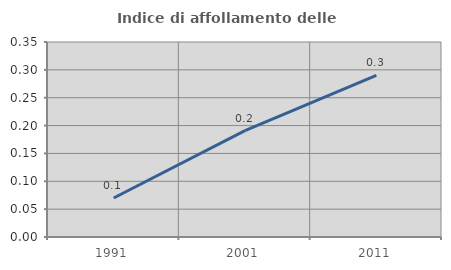
| Category | Indice di affollamento delle abitazioni  |
|---|---|
| 1991.0 | 0.07 |
| 2001.0 | 0.191 |
| 2011.0 | 0.29 |